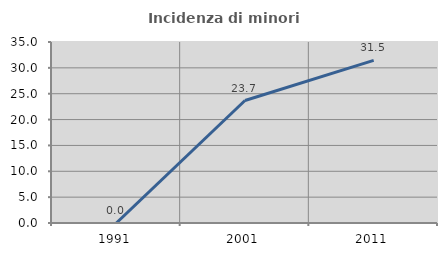
| Category | Incidenza di minori stranieri |
|---|---|
| 1991.0 | 0 |
| 2001.0 | 23.684 |
| 2011.0 | 31.452 |